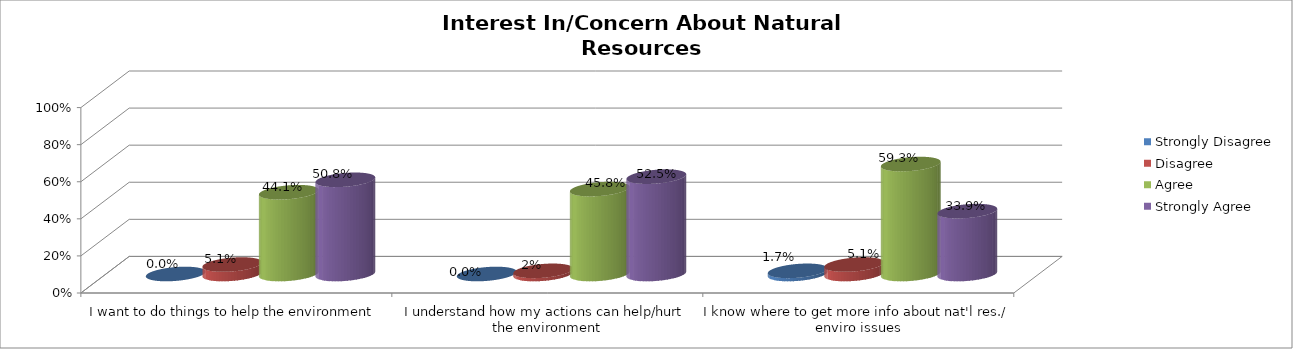
| Category | Strongly Disagree | Disagree | Agree | Strongly Agree |
|---|---|---|---|---|
| I want to do things to help the environment | 0 | 0.051 | 0.441 | 0.508 |
| I understand how my actions can help/hurt the environment | 0 | 0.017 | 0.458 | 0.525 |
| I know where to get more info about nat'l res./ enviro issues | 0.017 | 0.051 | 0.593 | 0.339 |